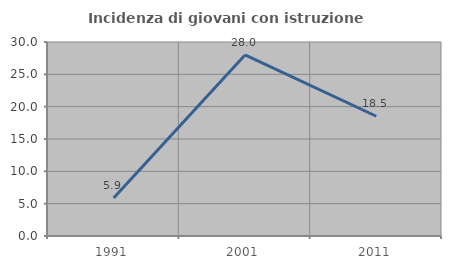
| Category | Incidenza di giovani con istruzione universitaria |
|---|---|
| 1991.0 | 5.882 |
| 2001.0 | 28 |
| 2011.0 | 18.519 |